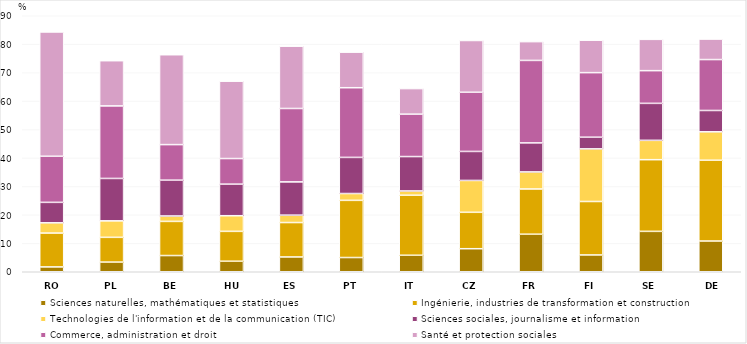
| Category | Sciences naturelles, mathématiques et statistiques | Ingénierie, industries de transformation et construction | Technologies de l'information et de la communication (TIC) | Sciences sociales, journalisme et information | Commerce, administration et droit | Santé et protection sociales |
|---|---|---|---|---|---|---|
| RO | 1.7 | 11.9 | 3.6 | 7.2 | 16.2 | 43.7 |
| PL | 3.4 | 8.7 | 5.8 | 14.9 | 25.5 | 15.9 |
| BE | 5.7 | 12 | 1.9 | 12.6 | 12.5 | 31.6 |
| HU | 3.7 | 10.5 | 5.5 | 11.1 | 9 | 27.2 |
| ES | 5.2 | 12.1 | 2.6 | 11.7 | 25.8 | 21.9 |
| PT | 5 | 20.1 | 2.4 | 12.7 | 24.5 | 12.5 |
| IT | 5.8 | 21.1 | 1.5 | 12.1 | 14.9 | 9 |
| CZ | 8.1 | 12.8 | 11.2 | 10.2 | 20.8 | 18.2 |
| FR | 13.2 | 15.9 | 6 | 10.2 | 29 | 6.6 |
| FI | 5.9 | 18.8 | 18.5 | 4.1 | 22.7 | 11.4 |
| SE | 14.2 | 25.2 | 6.8 | 13 | 11.5 | 11 |
| DE | 10.8 | 28.4 | 10 | 7.5 | 17.9 | 7.2 |